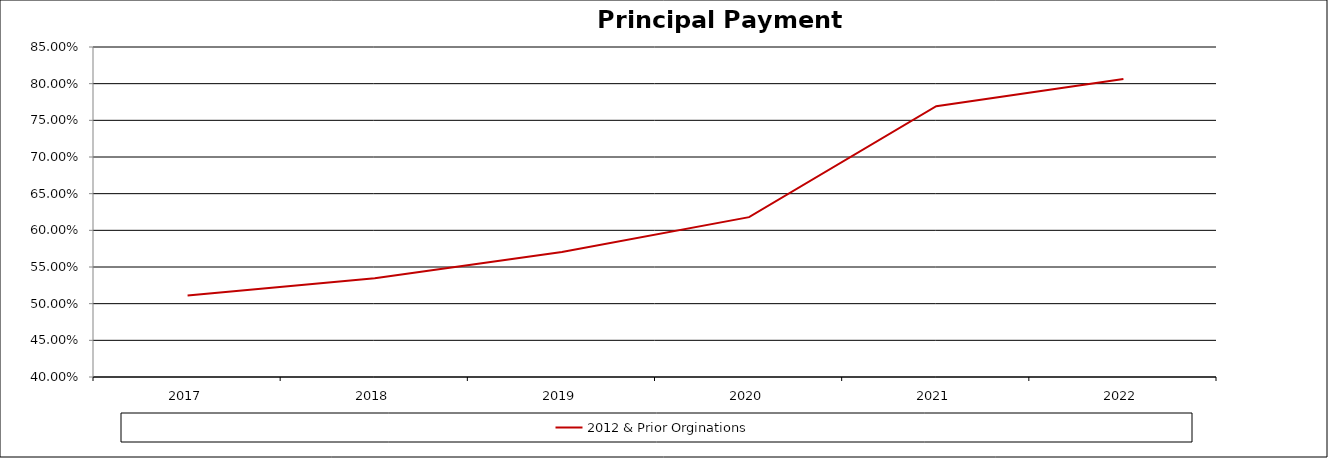
| Category | 2012 & Prior Orginations |
|---|---|
| 2017.0 | 0.511 |
| 2018.0 | 0.535 |
| 2019.0 | 0.57 |
| 2020.0 | 0.618 |
| 2021.0 | 0.769 |
| 44926.0 | 0.806 |